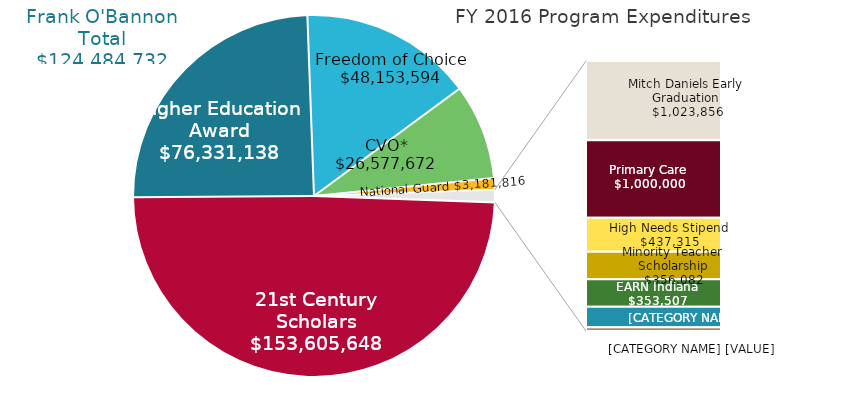
| Category | Series 0 |
|---|---|
| 21st Century Scholars | 153605648.31 |
| Higher Education Award | 76331137.8 |
| Freedom of Choice | 48153594 |
| CVO* | 26577671.81 |
| National Guard | 3181816 |
| Mitch Daniels Early Graduation | 1023856 |
| Primary Care | 1000000 |
| High Needs Stipend | 437314.72 |
| Minority Teacher Scholarship | 356081.8 |
| EARN Indiana | 353507.03 |
| Adult Student Grant | 265870 |
| Minority Teacher Stipend | 47449.22 |